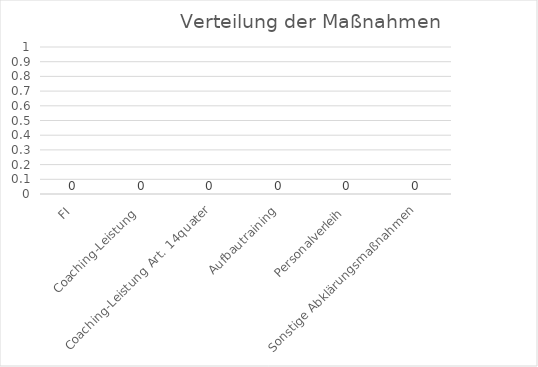
| Category | Series 0 |
|---|---|
| FI | 0 |
| Coaching-Leistung  | 0 |
| Coaching-Leistung Art. 14quater | 0 |
| Aufbautraining | 0 |
| Personalverleih | 0 |
| Sonstige Abklärungsmaßnahmen | 0 |